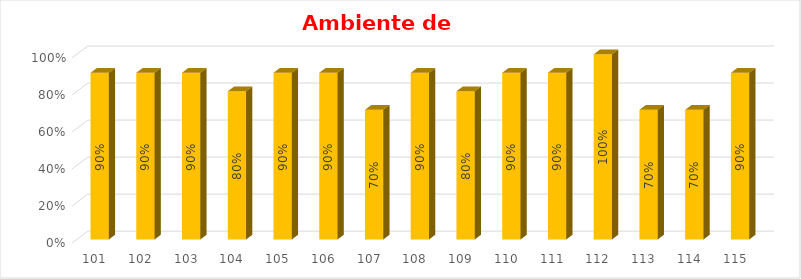
| Category | % Avance |
|---|---|
| 101.0 | 0.9 |
| 102.0 | 0.9 |
| 103.0 | 0.9 |
| 104.0 | 0.8 |
| 105.0 | 0.9 |
| 106.0 | 0.9 |
| 107.0 | 0.7 |
| 108.0 | 0.9 |
| 109.0 | 0.8 |
| 110.0 | 0.9 |
| 111.0 | 0.9 |
| 112.0 | 1 |
| 113.0 | 0.7 |
| 114.0 | 0.7 |
| 115.0 | 0.9 |